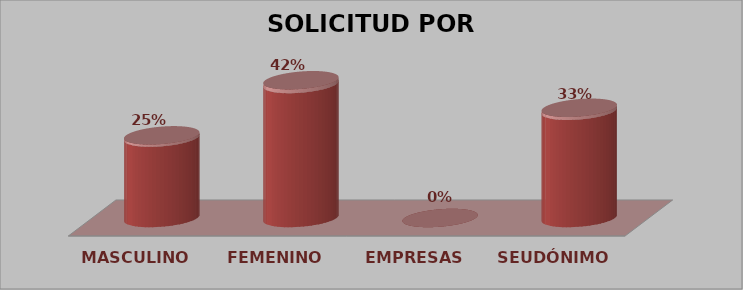
| Category | SOLICITUD POR GÉNERO | Series 1 |
|---|---|---|
| MASCULINO | 9 | 0.25 |
| FEMENINO | 15 | 0.417 |
| EMPRESAS | 0 | 0 |
| SEUDÓNIMO | 12 | 0.333 |